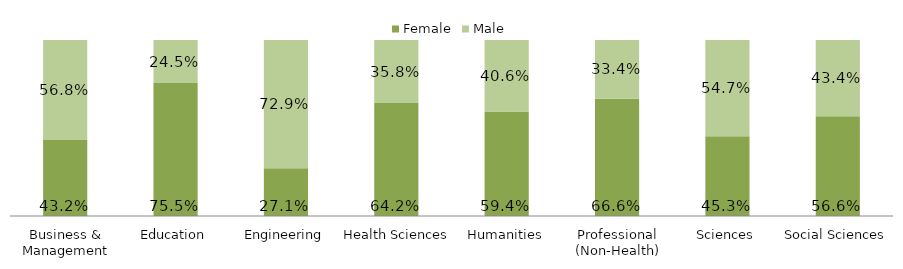
| Category | Female | Male |
|---|---|---|
| Business & Management | 0.432 | 0.568 |
| Education | 0.755 | 0.245 |
| Engineering | 0.271 | 0.729 |
| Health Sciences | 0.642 | 0.358 |
| Humanities | 0.594 | 0.406 |
| Professional (Non-Health) | 0.666 | 0.334 |
| Sciences | 0.453 | 0.547 |
| Social Sciences | 0.566 | 0.434 |